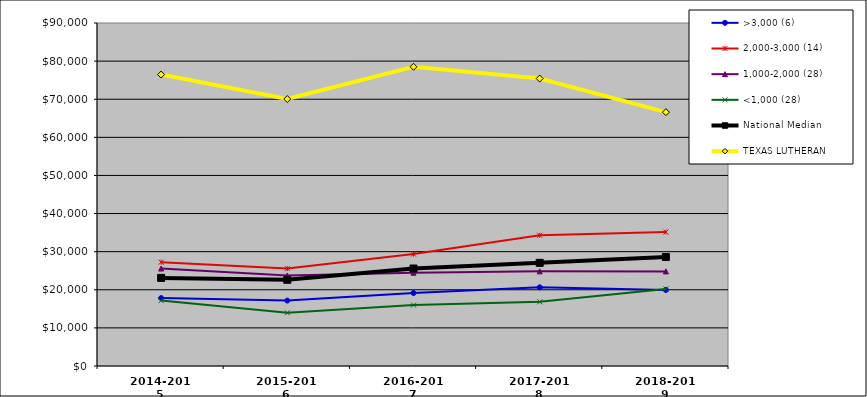
| Category | >3,000 (6) | 2,000-3,000 (14) | 1,000-2,000 (28) | <1,000 (28) | National Median | TEXAS LUTHERAN |
|---|---|---|---|---|---|---|
| 2014-2015 | 17814.621 | 27232.491 | 25574.363 | 17158.842 | 23117.708 | 76478.341 |
| 2015-2016 | 17163.453 | 25561.201 | 23751.571 | 13961.874 | 22619.893 | 70047.888 |
| 2016-2017 | 19153.212 | 29364.595 | 24479.417 | 15992.254 | 25581.053 | 78508.712 |
| 2017-2018 | 20646.142 | 34307.35 | 24828.826 | 16840.074 | 27067.87 | 75423 |
| 2018-2019 | 19955.947 | 35140.242 | 24824.366 | 20230.169 | 28604.166 | 66606.85 |